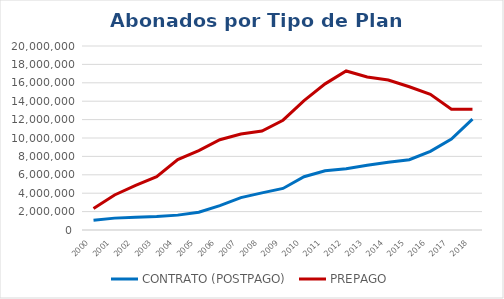
| Category | CONTRATO (POSTPAGO) | PREPAGO |
|---|---|---|
| 2000.0 | 1068130 | 2333395 |
| 2001.0 | 1290852 | 3809931 |
| 2002.0 | 1382871 | 4861439 |
| 2003.0 | 1473310 | 5794971 |
| 2004.0 | 1616653 | 7644732 |
| 2005.0 | 1931459 | 8638113 |
| 2006.0 | 2644224 | 9806577 |
| 2007.0 | 3523166 | 10432036 |
| 2008.0 | 4033678 | 10762915 |
| 2009.0 | 4517200 | 11933023 |
| 2010.0 | 5786405 | 14065837 |
| 2011.0 | 6429681 | 15885567 |
| 2012.0 | 6657716 | 17283257 |
| 2013.0 | 7031350 | 16629989 |
| 2014.0 | 7375577 | 16305141 |
| 2015.0 | 7638385 | 15567968 |
| 2016.0 | 8556131 | 14746472 |
| 2017.0 | 9878035 | 13135112 |
| 2018.0 | 12051532 | 13127449 |